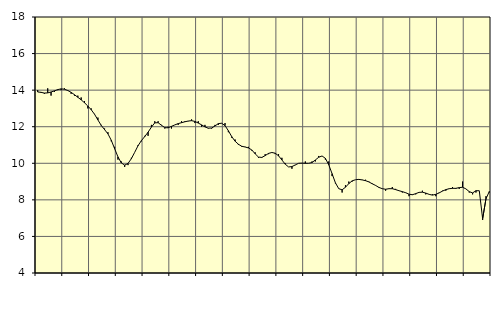
| Category | Piggar | Tillverkning av verkstadsvaror, SNI 25-30, 33 |
|---|---|---|
| nan | 14 | 13.9 |
| 87.0 | 13.9 | 13.88 |
| 87.0 | 13.8 | 13.84 |
| 87.0 | 14.1 | 13.85 |
| nan | 13.7 | 13.9 |
| 88.0 | 13.9 | 13.96 |
| 88.0 | 14 | 14.03 |
| 88.0 | 14 | 14.07 |
| nan | 14.1 | 14.05 |
| 89.0 | 14 | 13.98 |
| 89.0 | 13.8 | 13.88 |
| 89.0 | 13.7 | 13.75 |
| nan | 13.7 | 13.61 |
| 90.0 | 13.6 | 13.47 |
| 90.0 | 13.4 | 13.31 |
| 90.0 | 13 | 13.13 |
| nan | 13 | 12.93 |
| 91.0 | 12.7 | 12.68 |
| 91.0 | 12.5 | 12.37 |
| 91.0 | 12.1 | 12.07 |
| nan | 11.9 | 11.84 |
| 92.0 | 11.7 | 11.61 |
| 92.0 | 11.2 | 11.26 |
| 92.0 | 10.9 | 10.8 |
| nan | 10.2 | 10.35 |
| 93.0 | 10.1 | 10.02 |
| 93.0 | 9.8 | 9.9 |
| 93.0 | 9.9 | 9.99 |
| nan | 10.3 | 10.25 |
| 94.0 | 10.6 | 10.6 |
| 94.0 | 11 | 10.96 |
| 94.0 | 11.2 | 11.24 |
| nan | 11.5 | 11.46 |
| 95.0 | 11.5 | 11.7 |
| 95.0 | 12.1 | 11.98 |
| 95.0 | 12.3 | 12.21 |
| nan | 12.3 | 12.22 |
| 96.0 | 12.1 | 12.08 |
| 96.0 | 11.9 | 11.95 |
| 96.0 | 12 | 11.94 |
| nan | 11.9 | 12.02 |
| 97.0 | 12.1 | 12.1 |
| 97.0 | 12.1 | 12.17 |
| 97.0 | 12.3 | 12.22 |
| nan | 12.3 | 12.27 |
| 98.0 | 12.3 | 12.31 |
| 98.0 | 12.4 | 12.33 |
| 98.0 | 12.2 | 12.29 |
| nan | 12.3 | 12.2 |
| 99.0 | 12 | 12.1 |
| 99.0 | 12.1 | 11.99 |
| 99.0 | 11.9 | 11.92 |
| nan | 11.9 | 11.93 |
| 0.0 | 12.1 | 12.04 |
| 0.0 | 12.1 | 12.17 |
| 0.0 | 12.2 | 12.19 |
| nan | 12.2 | 12.06 |
| 1.0 | 11.7 | 11.78 |
| 1.0 | 11.4 | 11.46 |
| 1.0 | 11.3 | 11.21 |
| nan | 11 | 11.04 |
| 2.0 | 10.9 | 10.93 |
| 2.0 | 10.9 | 10.89 |
| 2.0 | 10.9 | 10.84 |
| nan | 10.7 | 10.73 |
| 3.0 | 10.6 | 10.52 |
| 3.0 | 10.3 | 10.34 |
| 3.0 | 10.3 | 10.32 |
| nan | 10.5 | 10.42 |
| 4.0 | 10.5 | 10.54 |
| 4.0 | 10.6 | 10.59 |
| 4.0 | 10.5 | 10.55 |
| nan | 10.5 | 10.41 |
| 5.0 | 10.3 | 10.18 |
| 5.0 | 10 | 9.95 |
| 5.0 | 9.8 | 9.8 |
| nan | 9.7 | 9.82 |
| 6.0 | 9.9 | 9.91 |
| 6.0 | 10 | 10 |
| 6.0 | 10 | 10.01 |
| nan | 10.1 | 10 |
| 7.0 | 10 | 10 |
| 7.0 | 10.1 | 10.04 |
| 7.0 | 10.1 | 10.18 |
| nan | 10.4 | 10.33 |
| 8.0 | 10.4 | 10.4 |
| 8.0 | 10.2 | 10.27 |
| 8.0 | 10.1 | 9.92 |
| nan | 9.3 | 9.43 |
| 9.0 | 8.9 | 8.93 |
| 9.0 | 8.6 | 8.61 |
| 9.0 | 8.4 | 8.55 |
| nan | 8.8 | 8.69 |
| 10.0 | 9 | 8.89 |
| 10.0 | 9 | 9.04 |
| 10.0 | 9.1 | 9.1 |
| nan | 9.1 | 9.12 |
| 11.0 | 9.1 | 9.09 |
| 11.0 | 9.1 | 9.05 |
| 11.0 | 9 | 8.98 |
| nan | 8.9 | 8.88 |
| 12.0 | 8.8 | 8.79 |
| 12.0 | 8.7 | 8.68 |
| 12.0 | 8.6 | 8.61 |
| nan | 8.5 | 8.58 |
| 13.0 | 8.6 | 8.61 |
| 13.0 | 8.7 | 8.61 |
| 13.0 | 8.6 | 8.56 |
| nan | 8.5 | 8.5 |
| 14.0 | 8.4 | 8.45 |
| 14.0 | 8.4 | 8.39 |
| 14.0 | 8.2 | 8.31 |
| nan | 8.3 | 8.28 |
| 15.0 | 8.3 | 8.34 |
| 15.0 | 8.4 | 8.41 |
| 15.0 | 8.5 | 8.42 |
| nan | 8.3 | 8.37 |
| 16.0 | 8.3 | 8.3 |
| 16.0 | 8.3 | 8.26 |
| 16.0 | 8.2 | 8.3 |
| nan | 8.4 | 8.38 |
| 17.0 | 8.5 | 8.48 |
| 17.0 | 8.5 | 8.56 |
| 17.0 | 8.6 | 8.61 |
| nan | 8.7 | 8.63 |
| 18.0 | 8.6 | 8.63 |
| 18.0 | 8.6 | 8.67 |
| 18.0 | 9 | 8.69 |
| nan | 8.6 | 8.6 |
| 19.0 | 8.4 | 8.45 |
| 19.0 | 8.3 | 8.38 |
| 19.0 | 8.4 | 8.5 |
| nan | 8.5 | 8.5 |
| 20.0 | 6.9 | 6.97 |
| 20.0 | 8.2 | 8.06 |
| 20.0 | 8.4 | 8.46 |